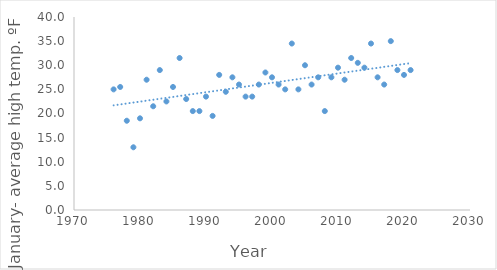
| Category | January- average high temp. ºF |
|---|---|
| 1976.0 | 25 |
| 1977.0 | 25.5 |
| 1978.0 | 18.5 |
| 1979.0 | 13 |
| 1980.0 | 19 |
| 1981.0 | 27 |
| 1982.0 | 21.5 |
| 1983.0 | 29 |
| 1984.0 | 22.5 |
| 1985.0 | 25.5 |
| 1986.0 | 31.5 |
| 1987.0 | 23 |
| 1988.0 | 20.5 |
| 1989.0 | 20.5 |
| 1990.0 | 23.5 |
| 1991.0 | 19.5 |
| 1992.0 | 28 |
| 1993.0 | 24.5 |
| 1994.0 | 27.5 |
| 1995.0 | 26 |
| 1996.0 | 23.5 |
| 1997.0 | 23.5 |
| 1998.0 | 26 |
| 1999.0 | 28.5 |
| 2000.0 | 27.5 |
| 2001.0 | 26 |
| 2002.0 | 25 |
| 2003.0 | 34.5 |
| 2004.0 | 25 |
| 2005.0 | 30 |
| 2006.0 | 26 |
| 2007.0 | 27.5 |
| 2008.0 | 20.5 |
| 2009.0 | 27.5 |
| 2010.0 | 29.5 |
| 2011.0 | 27 |
| 2012.0 | 31.5 |
| 2013.0 | 30.5 |
| 2014.0 | 29.5 |
| 2015.0 | 34.5 |
| 2016.0 | 27.5 |
| 2017.0 | 26 |
| 2018.0 | 35 |
| 2019.0 | 29 |
| 2020.0 | 28 |
| 2021.0 | 29 |